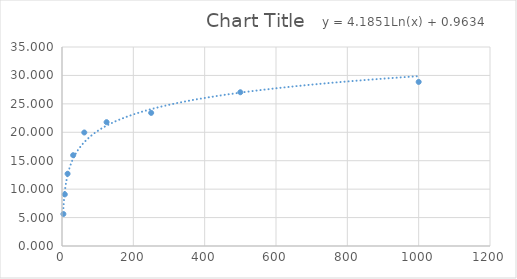
| Category | Series 0 |
|---|---|
| 3.91 | 5.626 |
| 7.81 | 9.074 |
| 15.62 | 12.704 |
| 31.25 | 15.971 |
| 62.5 | 19.964 |
| 125.0 | 21.779 |
| 250.0 | 23.412 |
| 500.0 | 27.042 |
| 1000.0 | 28.857 |